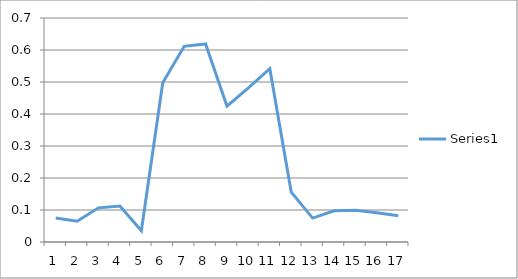
| Category | Series 0 |
|---|---|
| 0 | 0.075 |
| 1 | 0.065 |
| 2 | 0.107 |
| 3 | 0.112 |
| 4 | 0.035 |
| 5 | 0.498 |
| 6 | 0.611 |
| 7 | 0.619 |
| 8 | 0.424 |
| 9 | 0.482 |
| 10 | 0.541 |
| 11 | 0.156 |
| 12 | 0.075 |
| 13 | 0.098 |
| 14 | 0.099 |
| 15 | 0.092 |
| 16 | 0.082 |